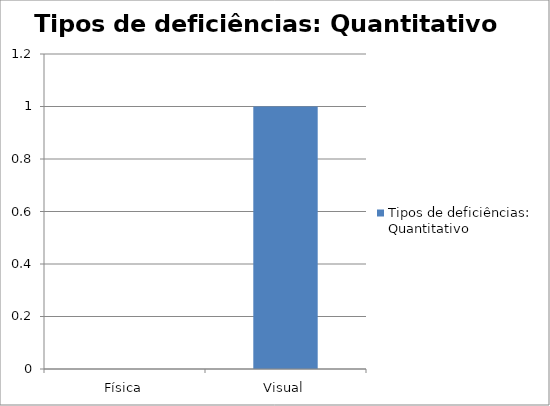
| Category | Tipos de deficiências: Quantitativo |
|---|---|
| Física | 0 |
| Visual | 1 |